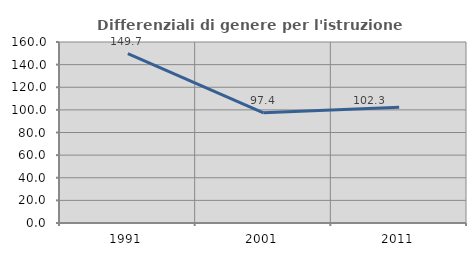
| Category | Differenziali di genere per l'istruzione superiore |
|---|---|
| 1991.0 | 149.693 |
| 2001.0 | 97.429 |
| 2011.0 | 102.273 |